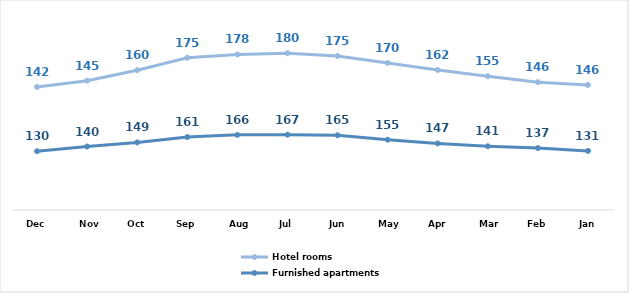
| Category | Furnished apartments | Hotel rooms |
|---|---|---|
| Jan | 130.643 | 145.702 |
| Feb | 136.932 | 145.633 |
| Mar | 140.921 | 154.714 |
| Apr | 147.135 | 162.402 |
| May | 155.366 | 169.575 |
| Jun | 165.135 | 175.144 |
| Jul | 166.544 | 179.933 |
| Aug | 166.068 | 177.619 |
| Sep | 161.206 | 175.318 |
| Oct | 149.325 | 159.631 |
| Nov | 140.33 | 145.412 |
| Dec | 129.918 | 142.14 |